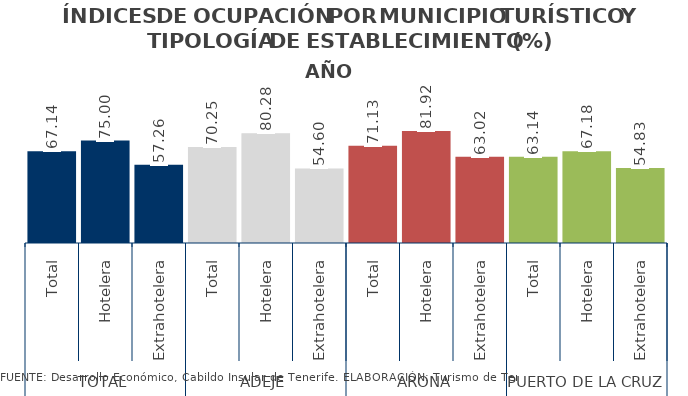
| Category | AÑO 2014 |
|---|---|
| 0 | 67.142 |
| 1 | 74.996 |
| 2 | 57.258 |
| 3 | 70.254 |
| 4 | 80.284 |
| 5 | 54.597 |
| 6 | 71.129 |
| 7 | 81.92 |
| 8 | 63.021 |
| 9 | 63.136 |
| 10 | 67.185 |
| 11 | 54.832 |